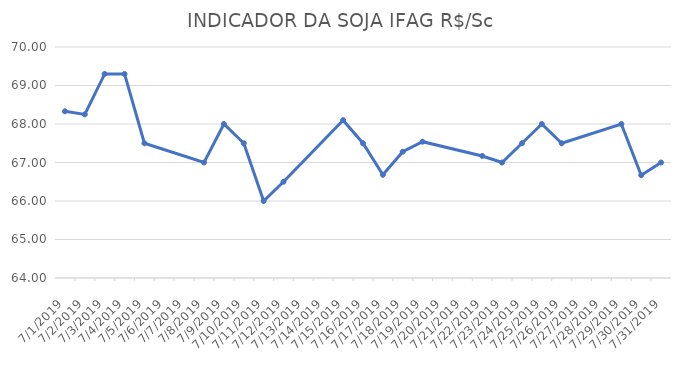
| Category | INDICADOR DA SOJA IFAG |
|---|---|
| 7/1/19 | 68.33 |
| 7/2/19 | 68.25 |
| 7/3/19 | 69.3 |
| 7/4/19 | 69.3 |
| 7/5/19 | 67.5 |
| 7/8/19 | 67 |
| 7/9/19 | 68 |
| 7/10/19 | 67.5 |
| 7/11/19 | 66 |
| 7/12/19 | 66.5 |
| 7/15/19 | 68.1 |
| 7/16/19 | 67.5 |
| 7/17/19 | 66.68 |
| 7/18/19 | 67.28 |
| 7/19/19 | 67.54 |
| 7/22/19 | 67.17 |
| 7/23/19 | 67 |
| 7/24/19 | 67.5 |
| 7/25/19 | 68 |
| 7/26/19 | 67.5 |
| 7/29/19 | 68 |
| 7/30/19 | 66.67 |
| 7/31/19 | 67 |